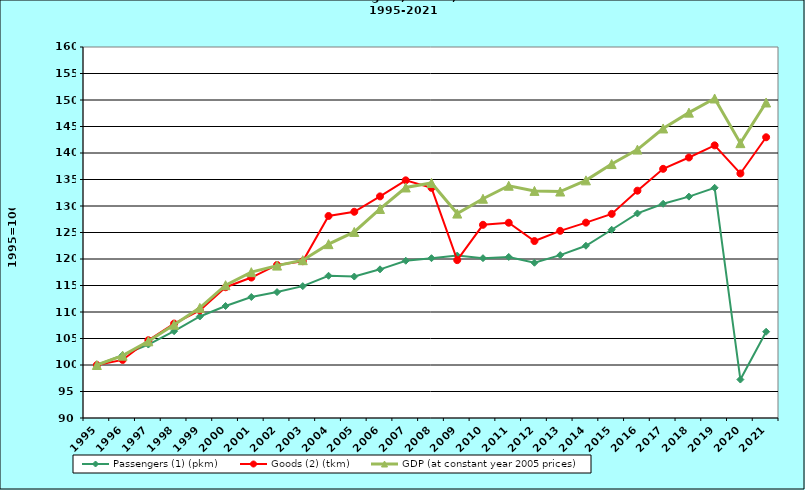
| Category | Passengers (1) (pkm) | Goods (2) (tkm) | GDP (at constant year 2005 prices) |
|---|---|---|---|
| 1995.0 | 100 | 100 | 100 |
| 1996.0 | 101.859 | 100.958 | 101.762 |
| 1997.0 | 103.861 | 104.673 | 104.468 |
| 1998.0 | 106.384 | 107.818 | 107.605 |
| 1999.0 | 109.152 | 110.301 | 110.781 |
| 2000.0 | 111.131 | 114.673 | 115.061 |
| 2001.0 | 112.83 | 116.499 | 117.517 |
| 2002.0 | 113.756 | 118.879 | 118.755 |
| 2003.0 | 114.882 | 119.579 | 119.776 |
| 2004.0 | 116.835 | 128.117 | 122.804 |
| 2005.0 | 116.69 | 128.91 | 125.109 |
| 2006.0 | 118.052 | 131.811 | 129.44 |
| 2007.0 | 119.671 | 134.842 | 133.494 |
| 2008.0 | 120.153 | 133.425 | 134.348 |
| 2009.0 | 120.644 | 119.788 | 128.569 |
| 2010.0 | 120.154 | 126.454 | 131.366 |
| 2011.0 | 120.383 | 126.842 | 133.821 |
| 2012.0 | 119.293 | 123.388 | 132.849 |
| 2013.0 | 120.727 | 125.314 | 132.727 |
| 2014.0 | 122.502 | 126.865 | 134.835 |
| 2015.0 | 125.519 | 128.511 | 137.914 |
| 2016.0 | 128.598 | 132.888 | 140.642 |
| 2017.0 | 130.421 | 137.012 | 144.629 |
| 2018.0 | 131.769 | 139.154 | 147.615 |
| 2019.0 | 133.432 | 141.44 | 150.285 |
| 2020.0 | 97.256 | 136.14 | 141.859 |
| 2021.0 | 106.279 | 142.966 | 149.53 |